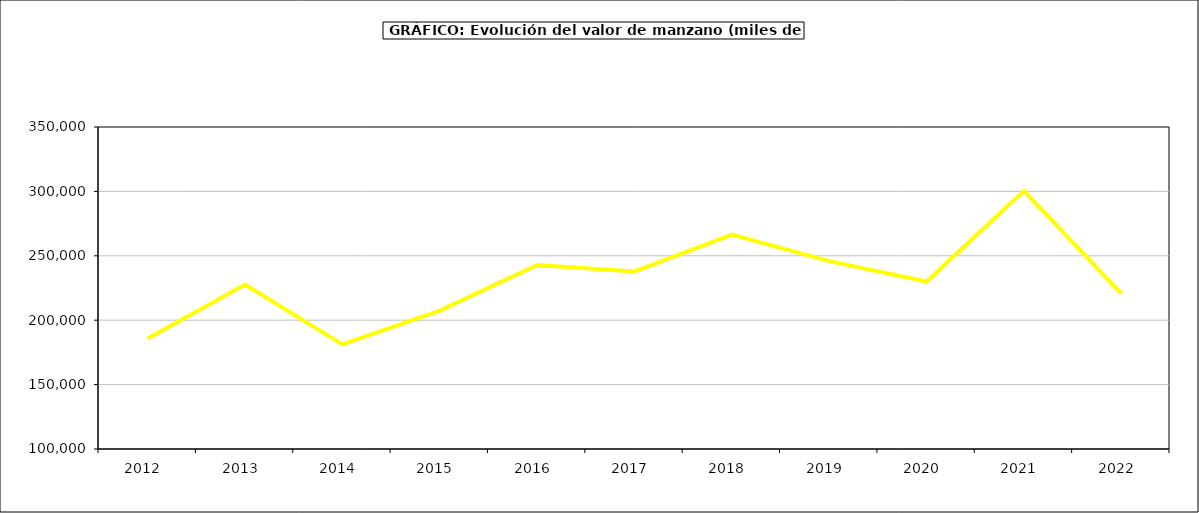
| Category | valor manzano |
|---|---|
| 2012.0 | 185703.956 |
| 2013.0 | 227733.263 |
| 2014.0 | 181209.741 |
| 2015.0 | 207515 |
| 2016.0 | 242923 |
| 2017.0 | 237842.719 |
| 2018.0 | 266393.145 |
| 2019.0 | 245889.131 |
| 2020.0 | 230039.865 |
| 2021.0 | 300463.556 |
| 2022.0 | 220585.096 |